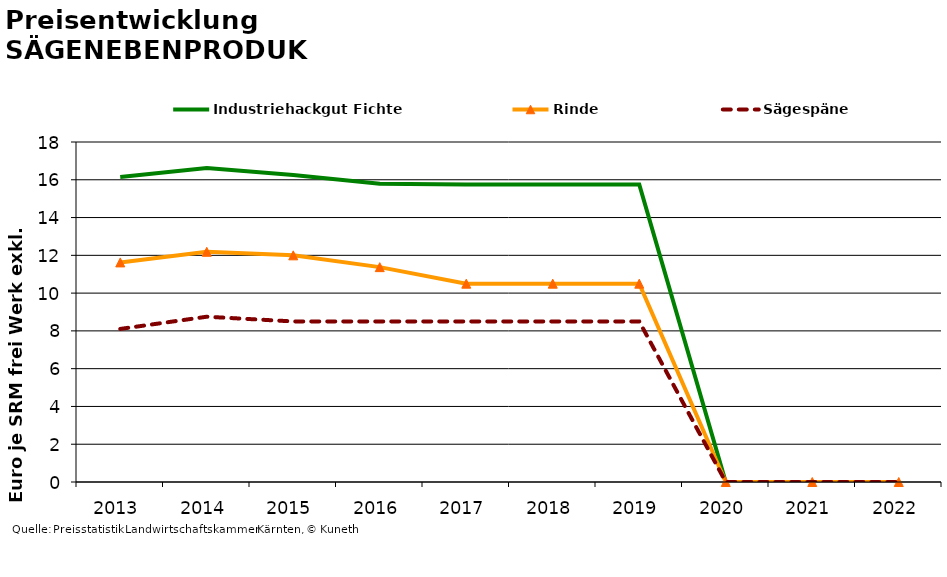
| Category | Industriehackgut Fichte | Rinde | Sägespäne |
|---|---|---|---|
| 2013.0 | 16.146 | 11.625 | 8.104 |
| 2014.0 | 16.625 | 12.188 | 8.75 |
| 2015.0 | 16.25 | 12 | 8.5 |
| 2016.0 | 15.792 | 11.375 | 8.5 |
| 2017.0 | 15.75 | 10.5 | 8.5 |
| 2018.0 | 15.75 | 10.5 | 8.5 |
| 2019.0 | 15.75 | 10.5 | 8.5 |
| 2020.0 | 0 | 0 | 0 |
| 2021.0 | 0 | 0 | 0 |
| 2022.0 | 0 | 0 | 0 |